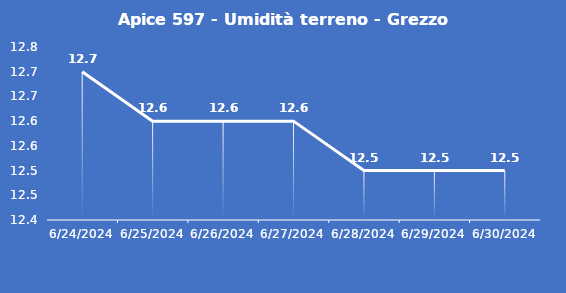
| Category | Apice 597 - Umidità terreno - Grezzo (%VWC) |
|---|---|
| 6/24/24 | 12.7 |
| 6/25/24 | 12.6 |
| 6/26/24 | 12.6 |
| 6/27/24 | 12.6 |
| 6/28/24 | 12.5 |
| 6/29/24 | 12.5 |
| 6/30/24 | 12.5 |